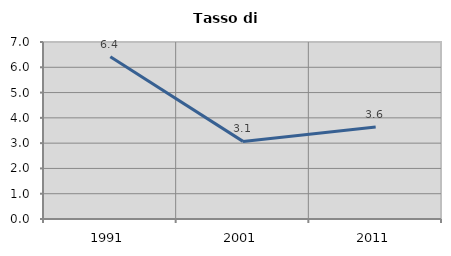
| Category | Tasso di disoccupazione   |
|---|---|
| 1991.0 | 6.414 |
| 2001.0 | 3.069 |
| 2011.0 | 3.641 |